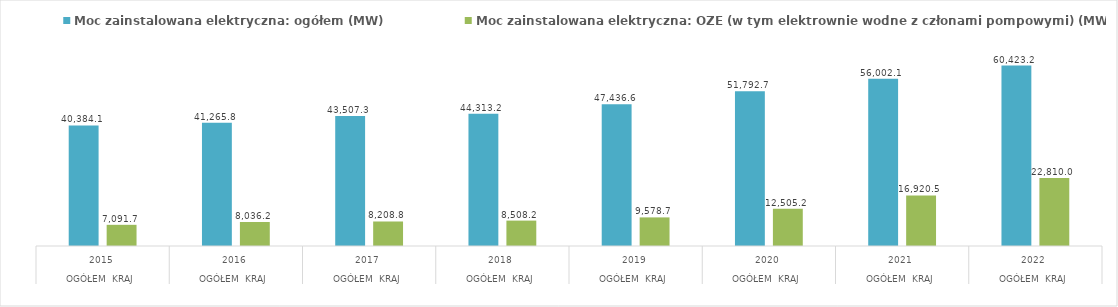
| Category | Moc zainstalowana elektryczna: ogółem (MW) | Moc zainstalowana elektryczna: OZE (w tym elektrownie wodne z członami pompowymi) (MW) |
|---|---|---|
| 0 | 40384.105 | 7091.66 |
| 1 | 41265.82 | 8036.22 |
| 2 | 43507.299 | 8208.79 |
| 3 | 44313.204 | 8508.21 |
| 4 | 47436.574 | 9578.72 |
| 5 | 51792.686 | 12505.17 |
| 6 | 56002.117 | 16920.531 |
| 7 | 60423.167 | 22809.992 |